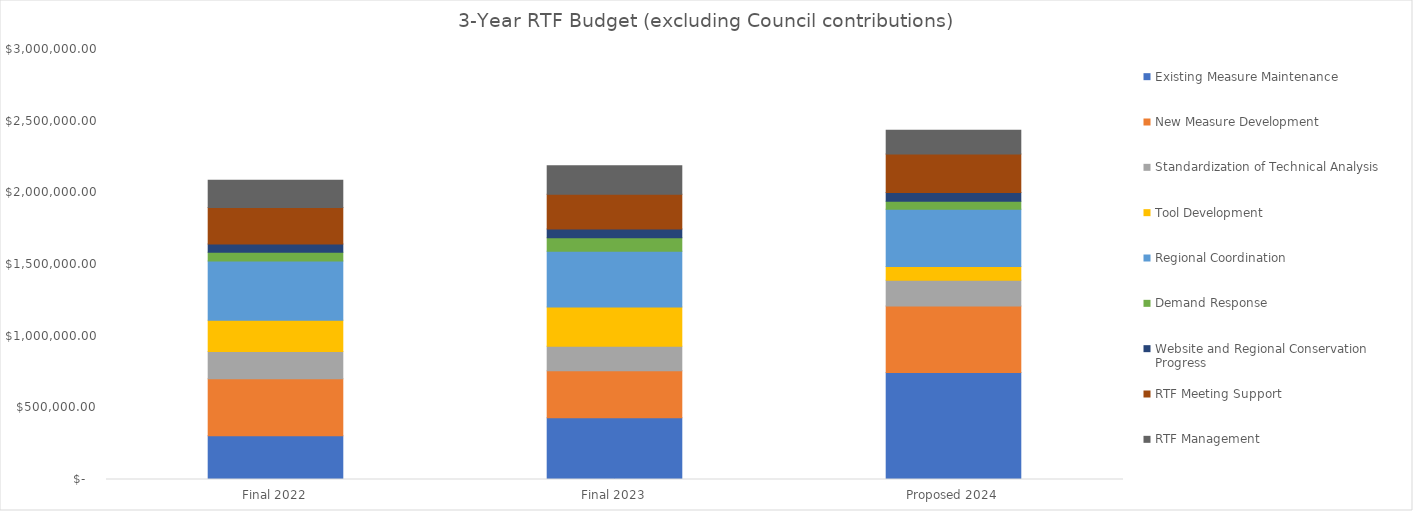
| Category | Existing Measure Maintenance | New Measure Development | Standardization of Technical Analysis | Tool Development | Regional Coordination | Demand Response | Website and Regional Conservation Progress | RTF Meeting Support | RTF Management |
|---|---|---|---|---|---|---|---|---|---|
| Final 2022 | 306000 | 396200 | 190500 | 218000 | 413500 | 61000 | 57400 | 254500 | 191000 |
| Final 2023 | 430000 | 329500 | 170000 | 273300 | 390000 | 93800 | 60800 | 242000 | 199000 |
| Proposed 2024 | 746200 | 463521 | 180000 | 96000 | 400100 | 55000 | 61200 | 269000 | 165900 |